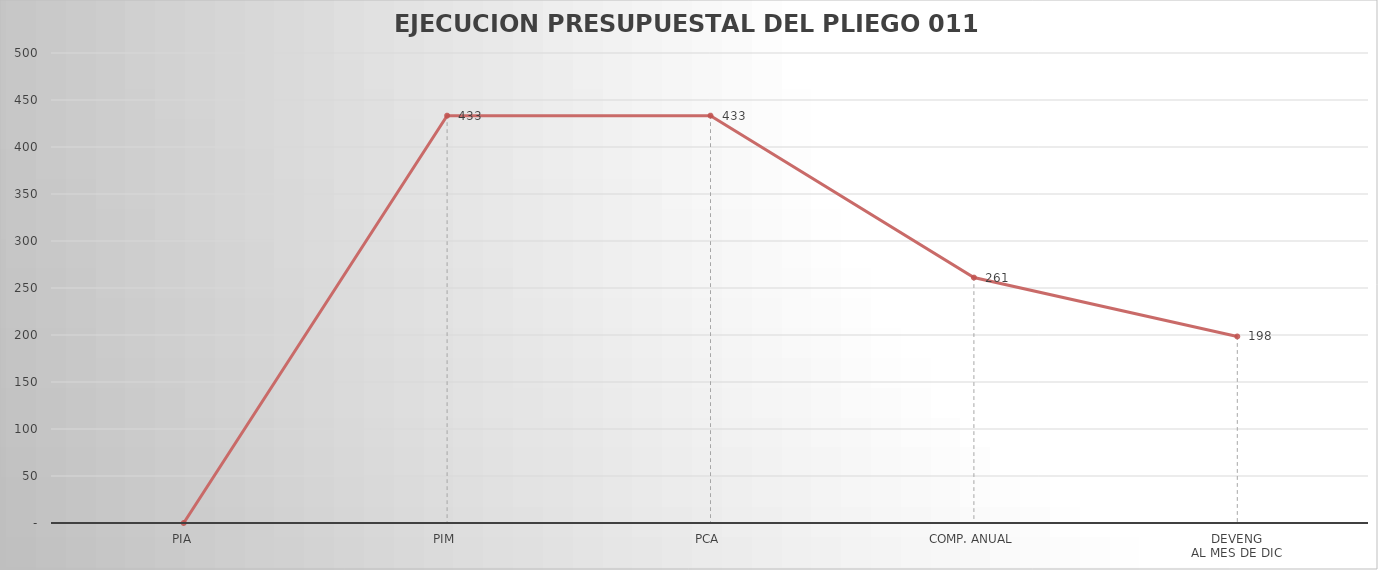
| Category | Series 0 |
|---|---|
| PIA | 0 |
| PIM | 433.372 |
| PCA | 433.372 |
| COMP. ANUAL | 261.092 |
| DEVENG
AL MES DE DIC | 198.437 |